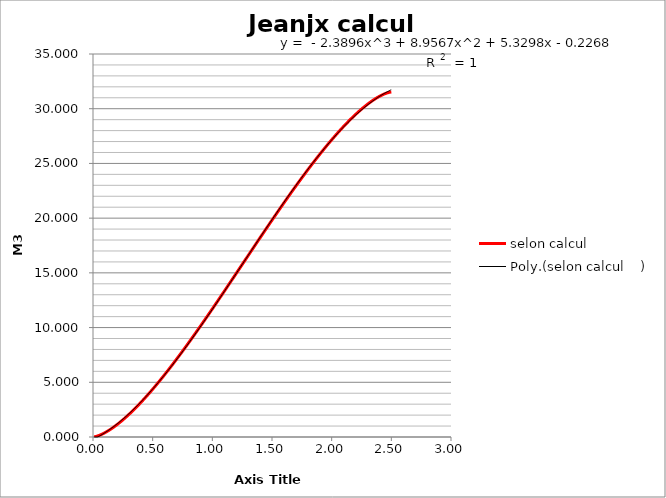
| Category | selon calcul |
|---|---|
| 0.01 | 0.012 |
| 0.02 | 0.035 |
| 0.03 | 0.064 |
| 0.04 | 0.099 |
| 0.05 | 0.139 |
| 0.06 | 0.183 |
| 0.07 | 0.231 |
| 0.08 | 0.283 |
| 0.09 | 0.337 |
| 0.1 | 0.395 |
| 0.11 | 0.456 |
| 0.12 | 0.52 |
| 0.13 | 0.587 |
| 0.14 | 0.656 |
| 0.15 | 0.728 |
| 0.16 | 0.802 |
| 0.17 | 0.878 |
| 0.18 | 0.957 |
| 0.19 | 1.038 |
| 0.2 | 1.121 |
| 0.21 | 1.206 |
| 0.22 | 1.293 |
| 0.23 | 1.381 |
| 0.24 | 1.472 |
| 0.25 | 1.565 |
| 0.26 | 1.659 |
| 0.27 | 1.755 |
| 0.28 | 1.853 |
| 0.29 | 1.953 |
| 0.3 | 2.054 |
| 0.31 | 2.156 |
| 0.32 | 2.261 |
| 0.33 | 2.366 |
| 0.34 | 2.474 |
| 0.35 | 2.582 |
| 0.36 | 2.692 |
| 0.37 | 2.804 |
| 0.38 | 2.917 |
| 0.39 | 3.031 |
| 0.4 | 3.146 |
| 0.41 | 3.263 |
| 0.42 | 3.381 |
| 0.43 | 3.5 |
| 0.44 | 3.621 |
| 0.45 | 3.742 |
| 0.46 | 3.865 |
| 0.47 | 3.989 |
| 0.48 | 4.114 |
| 0.49 | 4.24 |
| 0.5 | 4.367 |
| 0.51 | 4.496 |
| 0.52 | 4.625 |
| 0.53 | 4.755 |
| 0.54 | 4.886 |
| 0.55 | 5.019 |
| 0.56 | 5.152 |
| 0.57 | 5.286 |
| 0.58 | 5.421 |
| 0.59 | 5.557 |
| 0.6 | 5.694 |
| 0.61 | 5.831 |
| 0.62 | 5.97 |
| 0.63 | 6.109 |
| 0.64 | 6.249 |
| 0.65 | 6.39 |
| 0.66 | 6.532 |
| 0.67 | 6.674 |
| 0.68 | 6.817 |
| 0.69 | 6.961 |
| 0.7 | 7.106 |
| 0.71 | 7.251 |
| 0.72 | 7.397 |
| 0.73 | 7.544 |
| 0.74 | 7.691 |
| 0.75 | 7.839 |
| 0.76 | 7.988 |
| 0.77 | 8.137 |
| 0.78 | 8.287 |
| 0.79 | 8.438 |
| 0.8 | 8.589 |
| 0.81 | 8.74 |
| 0.82 | 8.892 |
| 0.83 | 9.045 |
| 0.84 | 9.198 |
| 0.85 | 9.352 |
| 0.86 | 9.506 |
| 0.87 | 9.66 |
| 0.88 | 9.815 |
| 0.89 | 9.971 |
| 0.9 | 10.127 |
| 0.91 | 10.283 |
| 0.92 | 10.44 |
| 0.93 | 10.597 |
| 0.94 | 10.755 |
| 0.95 | 10.913 |
| 0.96 | 11.071 |
| 0.97 | 11.229 |
| 0.98 | 11.388 |
| 0.99 | 11.548 |
| 1.0 | 11.707 |
| 1.01 | 11.867 |
| 1.02 | 12.027 |
| 1.03 | 12.188 |
| 1.04 | 12.348 |
| 1.05 | 12.509 |
| 1.06 | 12.67 |
| 1.07 | 12.832 |
| 1.08 | 12.994 |
| 1.09 | 13.155 |
| 1.1 | 13.317 |
| 1.11 | 13.48 |
| 1.12 | 13.642 |
| 1.13 | 13.804 |
| 1.14 | 13.967 |
| 1.15 | 14.13 |
| 1.16 | 14.293 |
| 1.17 | 14.456 |
| 1.18 | 14.619 |
| 1.19 | 14.782 |
| 1.2 | 14.945 |
| 1.21 | 15.108 |
| 1.22 | 15.272 |
| 1.23 | 15.435 |
| 1.24 | 15.598 |
| 1.25 | 15.762 |
| 1.26 | 15.925 |
| 1.27 | 16.089 |
| 1.28 | 16.252 |
| 1.29 | 16.415 |
| 1.3 | 16.579 |
| 1.31 | 16.742 |
| 1.32 | 16.905 |
| 1.33 | 17.068 |
| 1.34 | 17.231 |
| 1.35 | 17.394 |
| 1.36 | 17.557 |
| 1.37 | 17.719 |
| 1.38 | 17.882 |
| 1.39 | 18.044 |
| 1.4 | 18.206 |
| 1.41 | 18.368 |
| 1.42 | 18.53 |
| 1.43 | 18.692 |
| 1.44 | 18.853 |
| 1.45 | 19.014 |
| 1.46 | 19.175 |
| 1.47 | 19.336 |
| 1.48 | 19.496 |
| 1.49 | 19.657 |
| 1.5 | 19.817 |
| 1.51 | 19.976 |
| 1.52 | 20.135 |
| 1.53 | 20.294 |
| 1.54 | 20.453 |
| 1.55 | 20.611 |
| 1.56 | 20.769 |
| 1.57 | 20.927 |
| 1.58 | 21.084 |
| 1.59 | 21.241 |
| 1.6 | 21.397 |
| 1.61 | 21.553 |
| 1.62 | 21.708 |
| 1.63 | 21.863 |
| 1.64 | 22.018 |
| 1.65 | 22.172 |
| 1.66 | 22.326 |
| 1.67 | 22.479 |
| 1.68 | 22.631 |
| 1.69 | 22.784 |
| 1.7 | 22.935 |
| 1.71 | 23.086 |
| 1.72 | 23.237 |
| 1.73 | 23.386 |
| 1.74 | 23.536 |
| 1.75 | 23.684 |
| 1.76 | 23.832 |
| 1.77 | 23.98 |
| 1.78 | 24.126 |
| 1.79 | 24.272 |
| 1.8 | 24.418 |
| 1.81 | 24.562 |
| 1.82 | 24.706 |
| 1.83 | 24.85 |
| 1.84 | 24.992 |
| 1.85 | 25.134 |
| 1.86 | 25.275 |
| 1.87 | 25.415 |
| 1.88 | 25.554 |
| 1.89 | 25.693 |
| 1.9 | 25.83 |
| 1.91 | 25.967 |
| 1.92 | 26.103 |
| 1.93 | 26.238 |
| 1.94 | 26.372 |
| 1.95 | 26.505 |
| 1.96 | 26.637 |
| 1.97 | 26.769 |
| 1.98 | 26.899 |
| 1.99 | 27.028 |
| 2.0 | 27.156 |
| 2.01 | 27.284 |
| 2.02 | 27.41 |
| 2.03 | 27.535 |
| 2.04 | 27.659 |
| 2.05 | 27.781 |
| 2.06 | 27.903 |
| 2.07 | 28.023 |
| 2.08 | 28.143 |
| 2.09 | 28.261 |
| 2.1 | 28.377 |
| 2.11 | 28.493 |
| 2.12 | 28.607 |
| 2.13 | 28.72 |
| 2.14 | 28.831 |
| 2.15 | 28.941 |
| 2.16 | 29.05 |
| 2.17 | 29.157 |
| 2.18 | 29.263 |
| 2.19 | 29.367 |
| 2.2 | 29.47 |
| 2.21 | 29.571 |
| 2.22 | 29.671 |
| 2.23 | 29.768 |
| 2.24 | 29.864 |
| 2.25 | 29.959 |
| 2.26 | 30.051 |
| 2.27 | 30.142 |
| 2.28 | 30.231 |
| 2.29 | 30.318 |
| 2.3 | 30.403 |
| 2.31 | 30.486 |
| 2.32 | 30.567 |
| 2.33 | 30.646 |
| 2.34 | 30.722 |
| 2.35 | 30.796 |
| 2.36 | 30.868 |
| 2.37 | 30.937 |
| 2.38 | 31.003 |
| 2.39 | 31.067 |
| 2.4 | 31.128 |
| 2.41 | 31.186 |
| 2.42 | 31.241 |
| 2.43 | 31.293 |
| 2.44 | 31.341 |
| 2.45 | 31.385 |
| 2.46 | 31.424 |
| 2.47 | 31.459 |
| 2.48 | 31.489 |
| 2.49 | 31.511 |
| 2.5 | 31.524 |